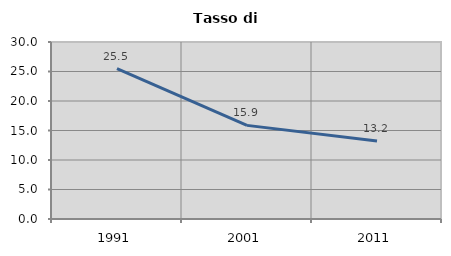
| Category | Tasso di disoccupazione   |
|---|---|
| 1991.0 | 25.473 |
| 2001.0 | 15.867 |
| 2011.0 | 13.208 |